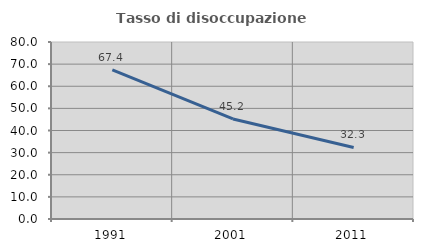
| Category | Tasso di disoccupazione giovanile  |
|---|---|
| 1991.0 | 67.37 |
| 2001.0 | 45.205 |
| 2011.0 | 32.333 |